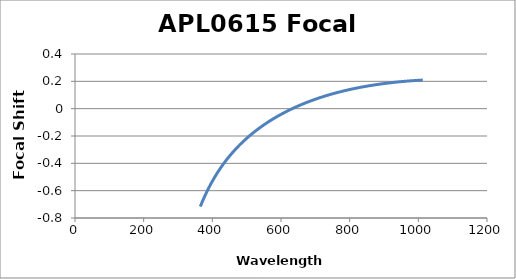
| Category | Focal Shift (mm) |
|---|---|
| 365.0 | -0.716 |
| 366.0 | -0.71 |
| 367.0 | -0.704 |
| 368.0 | -0.698 |
| 369.0 | -0.692 |
| 370.0 | -0.686 |
| 371.0 | -0.68 |
| 372.0 | -0.674 |
| 373.0 | -0.668 |
| 374.0 | -0.662 |
| 375.0 | -0.657 |
| 376.0 | -0.651 |
| 377.0 | -0.646 |
| 378.0 | -0.64 |
| 379.0 | -0.635 |
| 380.0 | -0.629 |
| 381.0 | -0.624 |
| 382.0 | -0.619 |
| 383.0 | -0.613 |
| 384.0 | -0.608 |
| 385.0 | -0.603 |
| 386.0 | -0.598 |
| 387.0 | -0.593 |
| 388.0 | -0.588 |
| 389.0 | -0.583 |
| 390.0 | -0.578 |
| 391.0 | -0.573 |
| 392.0 | -0.568 |
| 393.0 | -0.563 |
| 394.0 | -0.559 |
| 395.0 | -0.554 |
| 396.0 | -0.549 |
| 397.0 | -0.545 |
| 398.0 | -0.54 |
| 399.0 | -0.536 |
| 400.0 | -0.531 |
| 401.0 | -0.527 |
| 402.0 | -0.522 |
| 403.0 | -0.518 |
| 404.0 | -0.514 |
| 405.0 | -0.509 |
| 406.0 | -0.505 |
| 407.0 | -0.501 |
| 408.0 | -0.497 |
| 409.0 | -0.492 |
| 410.0 | -0.488 |
| 411.0 | -0.484 |
| 412.0 | -0.48 |
| 413.0 | -0.476 |
| 414.0 | -0.472 |
| 415.0 | -0.468 |
| 416.0 | -0.464 |
| 417.0 | -0.46 |
| 418.0 | -0.457 |
| 419.0 | -0.453 |
| 420.0 | -0.449 |
| 421.0 | -0.445 |
| 422.0 | -0.441 |
| 423.0 | -0.438 |
| 424.0 | -0.434 |
| 425.0 | -0.43 |
| 426.0 | -0.427 |
| 427.0 | -0.423 |
| 428.0 | -0.42 |
| 429.0 | -0.416 |
| 430.0 | -0.413 |
| 431.0 | -0.409 |
| 432.0 | -0.406 |
| 433.0 | -0.402 |
| 434.0 | -0.399 |
| 435.0 | -0.395 |
| 436.0 | -0.392 |
| 437.0 | -0.389 |
| 438.0 | -0.385 |
| 439.0 | -0.382 |
| 440.0 | -0.379 |
| 441.0 | -0.376 |
| 442.0 | -0.372 |
| 443.0 | -0.369 |
| 444.0 | -0.366 |
| 445.0 | -0.363 |
| 446.0 | -0.36 |
| 447.0 | -0.357 |
| 448.0 | -0.353 |
| 449.0 | -0.35 |
| 450.0 | -0.347 |
| 451.0 | -0.344 |
| 452.0 | -0.341 |
| 453.0 | -0.338 |
| 454.0 | -0.335 |
| 455.0 | -0.332 |
| 456.0 | -0.329 |
| 457.0 | -0.327 |
| 458.0 | -0.324 |
| 459.0 | -0.321 |
| 460.0 | -0.318 |
| 461.0 | -0.315 |
| 462.0 | -0.312 |
| 463.0 | -0.309 |
| 464.0 | -0.307 |
| 465.0 | -0.304 |
| 466.0 | -0.301 |
| 467.0 | -0.298 |
| 468.0 | -0.296 |
| 469.0 | -0.293 |
| 470.0 | -0.29 |
| 471.0 | -0.288 |
| 472.0 | -0.285 |
| 473.0 | -0.282 |
| 474.0 | -0.28 |
| 475.0 | -0.277 |
| 476.0 | -0.275 |
| 477.0 | -0.272 |
| 478.0 | -0.27 |
| 479.0 | -0.267 |
| 480.0 | -0.265 |
| 481.0 | -0.262 |
| 482.0 | -0.26 |
| 483.0 | -0.257 |
| 484.0 | -0.255 |
| 485.0 | -0.252 |
| 486.0 | -0.25 |
| 487.0 | -0.247 |
| 488.0 | -0.245 |
| 489.0 | -0.243 |
| 490.0 | -0.24 |
| 491.0 | -0.238 |
| 492.0 | -0.235 |
| 493.0 | -0.233 |
| 494.0 | -0.231 |
| 495.0 | -0.229 |
| 496.0 | -0.226 |
| 497.0 | -0.224 |
| 498.0 | -0.222 |
| 499.0 | -0.219 |
| 500.0 | -0.217 |
| 501.0 | -0.215 |
| 502.0 | -0.213 |
| 503.0 | -0.211 |
| 504.0 | -0.208 |
| 505.0 | -0.206 |
| 506.0 | -0.204 |
| 507.0 | -0.202 |
| 508.0 | -0.2 |
| 509.0 | -0.198 |
| 510.0 | -0.195 |
| 511.0 | -0.193 |
| 512.0 | -0.191 |
| 513.0 | -0.189 |
| 514.0 | -0.187 |
| 515.0 | -0.185 |
| 516.0 | -0.183 |
| 517.0 | -0.181 |
| 518.0 | -0.179 |
| 519.0 | -0.177 |
| 520.0 | -0.175 |
| 521.0 | -0.173 |
| 522.0 | -0.171 |
| 523.0 | -0.169 |
| 524.0 | -0.167 |
| 525.0 | -0.165 |
| 526.0 | -0.163 |
| 527.0 | -0.161 |
| 528.0 | -0.159 |
| 529.0 | -0.157 |
| 530.0 | -0.155 |
| 531.0 | -0.153 |
| 532.0 | -0.151 |
| 533.0 | -0.15 |
| 534.0 | -0.148 |
| 535.0 | -0.146 |
| 536.0 | -0.144 |
| 537.0 | -0.142 |
| 538.0 | -0.14 |
| 539.0 | -0.138 |
| 540.0 | -0.137 |
| 541.0 | -0.135 |
| 542.0 | -0.133 |
| 543.0 | -0.131 |
| 544.0 | -0.129 |
| 545.0 | -0.128 |
| 546.0 | -0.126 |
| 547.0 | -0.124 |
| 548.0 | -0.122 |
| 549.0 | -0.121 |
| 550.0 | -0.119 |
| 551.0 | -0.117 |
| 552.0 | -0.115 |
| 553.0 | -0.114 |
| 554.0 | -0.112 |
| 555.0 | -0.11 |
| 556.0 | -0.109 |
| 557.0 | -0.107 |
| 558.0 | -0.105 |
| 559.0 | -0.104 |
| 560.0 | -0.102 |
| 561.0 | -0.1 |
| 562.0 | -0.099 |
| 563.0 | -0.097 |
| 564.0 | -0.095 |
| 565.0 | -0.094 |
| 566.0 | -0.092 |
| 567.0 | -0.091 |
| 568.0 | -0.089 |
| 569.0 | -0.087 |
| 570.0 | -0.086 |
| 571.0 | -0.084 |
| 572.0 | -0.083 |
| 573.0 | -0.081 |
| 574.0 | -0.08 |
| 575.0 | -0.078 |
| 576.0 | -0.077 |
| 577.0 | -0.075 |
| 578.0 | -0.074 |
| 579.0 | -0.072 |
| 580.0 | -0.071 |
| 581.0 | -0.069 |
| 582.0 | -0.068 |
| 583.0 | -0.066 |
| 584.0 | -0.065 |
| 585.0 | -0.063 |
| 586.0 | -0.062 |
| 587.0 | -0.06 |
| 588.0 | -0.059 |
| 589.0 | -0.057 |
| 590.0 | -0.056 |
| 591.0 | -0.054 |
| 592.0 | -0.053 |
| 593.0 | -0.052 |
| 594.0 | -0.05 |
| 595.0 | -0.049 |
| 596.0 | -0.047 |
| 597.0 | -0.046 |
| 598.0 | -0.045 |
| 599.0 | -0.043 |
| 600.0 | -0.042 |
| 601.0 | -0.04 |
| 602.0 | -0.039 |
| 603.0 | -0.038 |
| 604.0 | -0.036 |
| 605.0 | -0.035 |
| 606.0 | -0.034 |
| 607.0 | -0.032 |
| 608.0 | -0.031 |
| 609.0 | -0.03 |
| 610.0 | -0.028 |
| 611.0 | -0.027 |
| 612.0 | -0.026 |
| 613.0 | -0.025 |
| 614.0 | -0.023 |
| 615.0 | -0.022 |
| 616.0 | -0.021 |
| 617.0 | -0.019 |
| 618.0 | -0.018 |
| 619.0 | -0.017 |
| 620.0 | -0.016 |
| 621.0 | -0.014 |
| 622.0 | -0.013 |
| 623.0 | -0.012 |
| 624.0 | -0.011 |
| 625.0 | -0.009 |
| 626.0 | -0.008 |
| 627.0 | -0.007 |
| 628.0 | -0.006 |
| 629.0 | -0.005 |
| 630.0 | -0.003 |
| 631.0 | -0.002 |
| 632.0 | -0.001 |
| 633.0 | 0 |
| 634.0 | 0.001 |
| 635.0 | 0.003 |
| 636.0 | 0.004 |
| 637.0 | 0.005 |
| 638.0 | 0.006 |
| 639.0 | 0.007 |
| 640.0 | 0.008 |
| 641.0 | 0.01 |
| 642.0 | 0.011 |
| 643.0 | 0.012 |
| 644.0 | 0.013 |
| 645.0 | 0.014 |
| 646.0 | 0.015 |
| 647.0 | 0.016 |
| 648.0 | 0.017 |
| 649.0 | 0.018 |
| 650.0 | 0.02 |
| 651.0 | 0.021 |
| 652.0 | 0.022 |
| 653.0 | 0.023 |
| 654.0 | 0.024 |
| 655.0 | 0.025 |
| 656.0 | 0.026 |
| 657.0 | 0.027 |
| 658.0 | 0.028 |
| 659.0 | 0.029 |
| 660.0 | 0.03 |
| 661.0 | 0.031 |
| 662.0 | 0.032 |
| 663.0 | 0.033 |
| 664.0 | 0.035 |
| 665.0 | 0.036 |
| 666.0 | 0.037 |
| 667.0 | 0.038 |
| 668.0 | 0.039 |
| 669.0 | 0.04 |
| 670.0 | 0.041 |
| 671.0 | 0.042 |
| 672.0 | 0.043 |
| 673.0 | 0.044 |
| 674.0 | 0.045 |
| 675.0 | 0.046 |
| 676.0 | 0.047 |
| 677.0 | 0.048 |
| 678.0 | 0.049 |
| 679.0 | 0.05 |
| 680.0 | 0.05 |
| 681.0 | 0.051 |
| 682.0 | 0.052 |
| 683.0 | 0.053 |
| 684.0 | 0.054 |
| 685.0 | 0.055 |
| 686.0 | 0.056 |
| 687.0 | 0.057 |
| 688.0 | 0.058 |
| 689.0 | 0.059 |
| 690.0 | 0.06 |
| 691.0 | 0.061 |
| 692.0 | 0.062 |
| 693.0 | 0.063 |
| 694.0 | 0.064 |
| 695.0 | 0.064 |
| 696.0 | 0.065 |
| 697.0 | 0.066 |
| 698.0 | 0.067 |
| 699.0 | 0.068 |
| 700.0 | 0.069 |
| 701.0 | 0.07 |
| 702.0 | 0.071 |
| 703.0 | 0.072 |
| 704.0 | 0.072 |
| 705.0 | 0.073 |
| 706.0 | 0.074 |
| 707.0 | 0.075 |
| 708.0 | 0.076 |
| 709.0 | 0.077 |
| 710.0 | 0.078 |
| 711.0 | 0.078 |
| 712.0 | 0.079 |
| 713.0 | 0.08 |
| 714.0 | 0.081 |
| 715.0 | 0.082 |
| 716.0 | 0.083 |
| 717.0 | 0.083 |
| 718.0 | 0.084 |
| 719.0 | 0.085 |
| 720.0 | 0.086 |
| 721.0 | 0.087 |
| 722.0 | 0.087 |
| 723.0 | 0.088 |
| 724.0 | 0.089 |
| 725.0 | 0.09 |
| 726.0 | 0.091 |
| 727.0 | 0.091 |
| 728.0 | 0.092 |
| 729.0 | 0.093 |
| 730.0 | 0.094 |
| 731.0 | 0.094 |
| 732.0 | 0.095 |
| 733.0 | 0.096 |
| 734.0 | 0.097 |
| 735.0 | 0.098 |
| 736.0 | 0.098 |
| 737.0 | 0.099 |
| 738.0 | 0.1 |
| 739.0 | 0.101 |
| 740.0 | 0.101 |
| 741.0 | 0.102 |
| 742.0 | 0.103 |
| 743.0 | 0.103 |
| 744.0 | 0.104 |
| 745.0 | 0.105 |
| 746.0 | 0.106 |
| 747.0 | 0.106 |
| 748.0 | 0.107 |
| 749.0 | 0.108 |
| 750.0 | 0.108 |
| 751.0 | 0.109 |
| 752.0 | 0.11 |
| 753.0 | 0.111 |
| 754.0 | 0.111 |
| 755.0 | 0.112 |
| 756.0 | 0.113 |
| 757.0 | 0.113 |
| 758.0 | 0.114 |
| 759.0 | 0.115 |
| 760.0 | 0.115 |
| 761.0 | 0.116 |
| 762.0 | 0.117 |
| 763.0 | 0.117 |
| 764.0 | 0.118 |
| 765.0 | 0.119 |
| 766.0 | 0.119 |
| 767.0 | 0.12 |
| 768.0 | 0.121 |
| 769.0 | 0.121 |
| 770.0 | 0.122 |
| 771.0 | 0.123 |
| 772.0 | 0.123 |
| 773.0 | 0.124 |
| 774.0 | 0.125 |
| 775.0 | 0.125 |
| 776.0 | 0.126 |
| 777.0 | 0.126 |
| 778.0 | 0.127 |
| 779.0 | 0.128 |
| 780.0 | 0.128 |
| 781.0 | 0.129 |
| 782.0 | 0.129 |
| 783.0 | 0.13 |
| 784.0 | 0.131 |
| 785.0 | 0.131 |
| 786.0 | 0.132 |
| 787.0 | 0.132 |
| 788.0 | 0.133 |
| 789.0 | 0.134 |
| 790.0 | 0.134 |
| 791.0 | 0.135 |
| 792.0 | 0.135 |
| 793.0 | 0.136 |
| 794.0 | 0.137 |
| 795.0 | 0.137 |
| 796.0 | 0.138 |
| 797.0 | 0.138 |
| 798.0 | 0.139 |
| 799.0 | 0.139 |
| 800.0 | 0.14 |
| 801.0 | 0.141 |
| 802.0 | 0.141 |
| 803.0 | 0.142 |
| 804.0 | 0.142 |
| 805.0 | 0.143 |
| 806.0 | 0.143 |
| 807.0 | 0.144 |
| 808.0 | 0.144 |
| 809.0 | 0.145 |
| 810.0 | 0.145 |
| 811.0 | 0.146 |
| 812.0 | 0.146 |
| 813.0 | 0.147 |
| 814.0 | 0.148 |
| 815.0 | 0.148 |
| 816.0 | 0.149 |
| 817.0 | 0.149 |
| 818.0 | 0.15 |
| 819.0 | 0.15 |
| 820.0 | 0.151 |
| 821.0 | 0.151 |
| 822.0 | 0.152 |
| 823.0 | 0.152 |
| 824.0 | 0.153 |
| 825.0 | 0.153 |
| 826.0 | 0.154 |
| 827.0 | 0.154 |
| 828.0 | 0.155 |
| 829.0 | 0.155 |
| 830.0 | 0.156 |
| 831.0 | 0.156 |
| 832.0 | 0.156 |
| 833.0 | 0.157 |
| 834.0 | 0.157 |
| 835.0 | 0.158 |
| 836.0 | 0.158 |
| 837.0 | 0.159 |
| 838.0 | 0.159 |
| 839.0 | 0.16 |
| 840.0 | 0.16 |
| 841.0 | 0.161 |
| 842.0 | 0.161 |
| 843.0 | 0.162 |
| 844.0 | 0.162 |
| 845.0 | 0.162 |
| 846.0 | 0.163 |
| 847.0 | 0.163 |
| 848.0 | 0.164 |
| 849.0 | 0.164 |
| 850.0 | 0.165 |
| 851.0 | 0.165 |
| 852.0 | 0.166 |
| 853.0 | 0.166 |
| 854.0 | 0.166 |
| 855.0 | 0.167 |
| 856.0 | 0.167 |
| 857.0 | 0.168 |
| 858.0 | 0.168 |
| 859.0 | 0.169 |
| 860.0 | 0.169 |
| 861.0 | 0.169 |
| 862.0 | 0.17 |
| 863.0 | 0.17 |
| 864.0 | 0.171 |
| 865.0 | 0.171 |
| 866.0 | 0.171 |
| 867.0 | 0.172 |
| 868.0 | 0.172 |
| 869.0 | 0.173 |
| 870.0 | 0.173 |
| 871.0 | 0.173 |
| 872.0 | 0.174 |
| 873.0 | 0.174 |
| 874.0 | 0.174 |
| 875.0 | 0.175 |
| 876.0 | 0.175 |
| 877.0 | 0.176 |
| 878.0 | 0.176 |
| 879.0 | 0.176 |
| 880.0 | 0.177 |
| 881.0 | 0.177 |
| 882.0 | 0.177 |
| 883.0 | 0.178 |
| 884.0 | 0.178 |
| 885.0 | 0.179 |
| 886.0 | 0.179 |
| 887.0 | 0.179 |
| 888.0 | 0.18 |
| 889.0 | 0.18 |
| 890.0 | 0.18 |
| 891.0 | 0.181 |
| 892.0 | 0.181 |
| 893.0 | 0.181 |
| 894.0 | 0.182 |
| 895.0 | 0.182 |
| 896.0 | 0.182 |
| 897.0 | 0.183 |
| 898.0 | 0.183 |
| 899.0 | 0.183 |
| 900.0 | 0.184 |
| 901.0 | 0.184 |
| 902.0 | 0.184 |
| 903.0 | 0.185 |
| 904.0 | 0.185 |
| 905.0 | 0.185 |
| 906.0 | 0.186 |
| 907.0 | 0.186 |
| 908.0 | 0.186 |
| 909.0 | 0.187 |
| 910.0 | 0.187 |
| 911.0 | 0.187 |
| 912.0 | 0.187 |
| 913.0 | 0.188 |
| 914.0 | 0.188 |
| 915.0 | 0.188 |
| 916.0 | 0.189 |
| 917.0 | 0.189 |
| 918.0 | 0.189 |
| 919.0 | 0.19 |
| 920.0 | 0.19 |
| 921.0 | 0.19 |
| 922.0 | 0.19 |
| 923.0 | 0.191 |
| 924.0 | 0.191 |
| 925.0 | 0.191 |
| 926.0 | 0.192 |
| 927.0 | 0.192 |
| 928.0 | 0.192 |
| 929.0 | 0.192 |
| 930.0 | 0.193 |
| 931.0 | 0.193 |
| 932.0 | 0.193 |
| 933.0 | 0.193 |
| 934.0 | 0.194 |
| 935.0 | 0.194 |
| 936.0 | 0.194 |
| 937.0 | 0.195 |
| 938.0 | 0.195 |
| 939.0 | 0.195 |
| 940.0 | 0.195 |
| 941.0 | 0.196 |
| 942.0 | 0.196 |
| 943.0 | 0.196 |
| 944.0 | 0.196 |
| 945.0 | 0.197 |
| 946.0 | 0.197 |
| 947.0 | 0.197 |
| 948.0 | 0.197 |
| 949.0 | 0.197 |
| 950.0 | 0.198 |
| 951.0 | 0.198 |
| 952.0 | 0.198 |
| 953.0 | 0.198 |
| 954.0 | 0.199 |
| 955.0 | 0.199 |
| 956.0 | 0.199 |
| 957.0 | 0.199 |
| 958.0 | 0.2 |
| 959.0 | 0.2 |
| 960.0 | 0.2 |
| 961.0 | 0.2 |
| 962.0 | 0.2 |
| 963.0 | 0.201 |
| 964.0 | 0.201 |
| 965.0 | 0.201 |
| 966.0 | 0.201 |
| 967.0 | 0.202 |
| 968.0 | 0.202 |
| 969.0 | 0.202 |
| 970.0 | 0.202 |
| 971.0 | 0.202 |
| 972.0 | 0.203 |
| 973.0 | 0.203 |
| 974.0 | 0.203 |
| 975.0 | 0.203 |
| 976.0 | 0.203 |
| 977.0 | 0.204 |
| 978.0 | 0.204 |
| 979.0 | 0.204 |
| 980.0 | 0.204 |
| 981.0 | 0.204 |
| 982.0 | 0.204 |
| 983.0 | 0.205 |
| 984.0 | 0.205 |
| 985.0 | 0.205 |
| 986.0 | 0.205 |
| 987.0 | 0.205 |
| 988.0 | 0.206 |
| 989.0 | 0.206 |
| 990.0 | 0.206 |
| 991.0 | 0.206 |
| 992.0 | 0.206 |
| 993.0 | 0.206 |
| 994.0 | 0.207 |
| 995.0 | 0.207 |
| 996.0 | 0.207 |
| 997.0 | 0.207 |
| 998.0 | 0.207 |
| 999.0 | 0.207 |
| 1000.0 | 0.208 |
| 1001.0 | 0.208 |
| 1002.0 | 0.208 |
| 1003.0 | 0.208 |
| 1004.0 | 0.208 |
| 1005.0 | 0.208 |
| 1006.0 | 0.208 |
| 1007.0 | 0.209 |
| 1008.0 | 0.209 |
| 1009.0 | 0.209 |
| 1010.0 | 0.209 |
| 1011.0 | 0.209 |
| 1012.0 | 0.209 |
| 1013.0 | 0.209 |